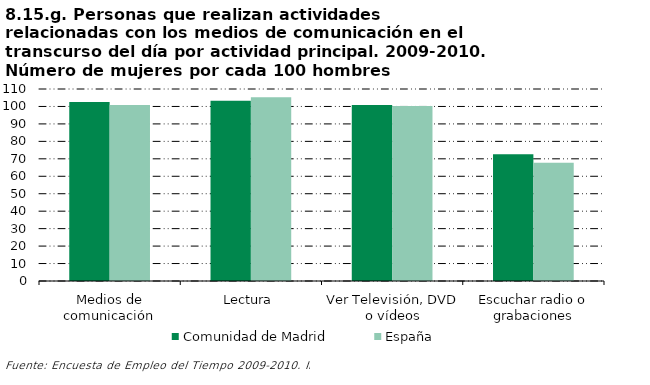
| Category | Comunidad de Madrid | España |
|---|---|---|
| Medios de comunicación | 102.488 | 100.795 |
| Lectura | 103.32 | 105.288 |
| Ver Televisión, DVD o vídeos | 100.864 | 100.237 |
| Escuchar radio o grabaciones | 72.551 | 67.742 |